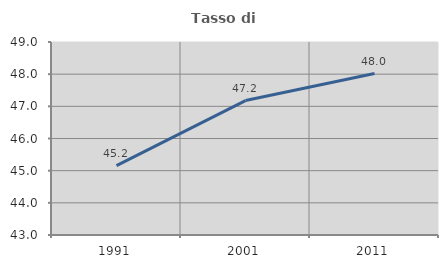
| Category | Tasso di occupazione   |
|---|---|
| 1991.0 | 45.157 |
| 2001.0 | 47.179 |
| 2011.0 | 48.02 |